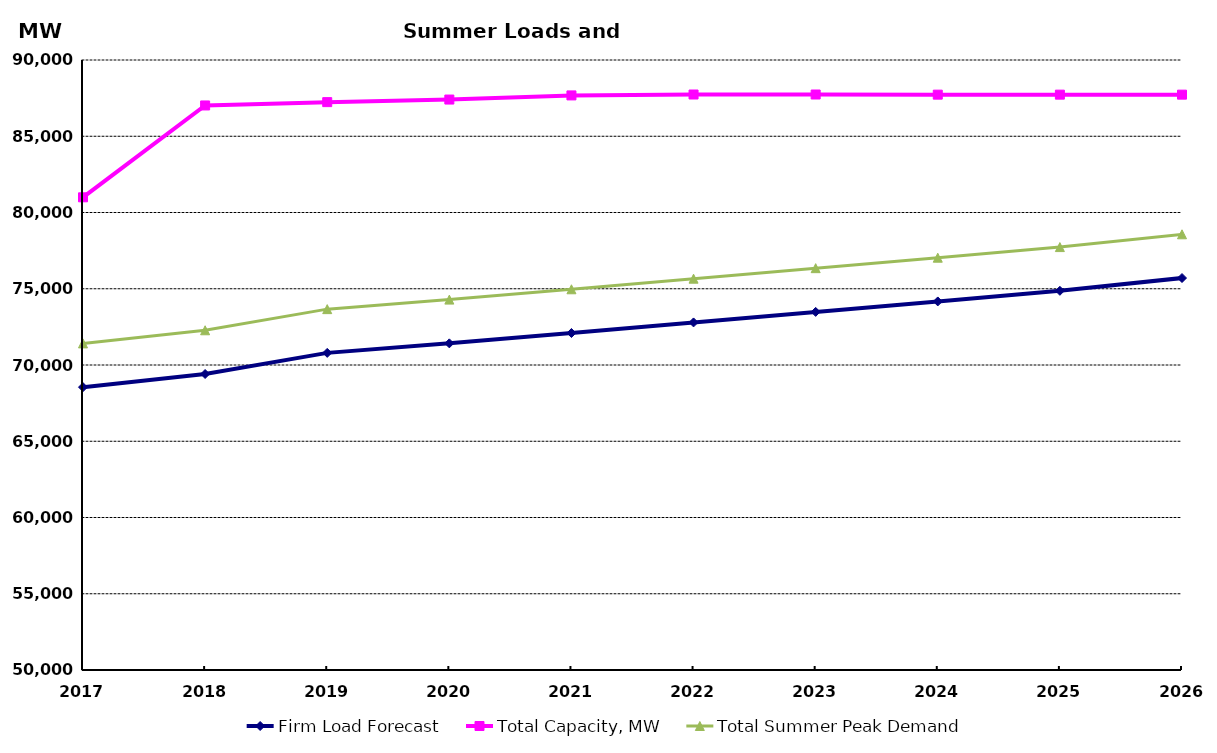
| Category | Firm Load Forecast | Total Capacity, MW | Total Summer Peak Demand |
|---|---|---|---|
| 2017.0 | 68548 | 80994.968 | 71416 |
| 2018.0 | 69409 | 87019.294 | 72277 |
| 2019.0 | 70795 | 87237.654 | 73663 |
| 2020.0 | 71420 | 87406.654 | 74288 |
| 2021.0 | 72098 | 87677.654 | 74966 |
| 2022.0 | 72792 | 87737.654 | 75660 |
| 2023.0 | 73482 | 87737.654 | 76350 |
| 2024.0 | 74168 | 87727.654 | 77036 |
| 2025.0 | 74864 | 87727.654 | 77732 |
| 2026.0 | 75703.506 | 87727.654 | 78571.506 |